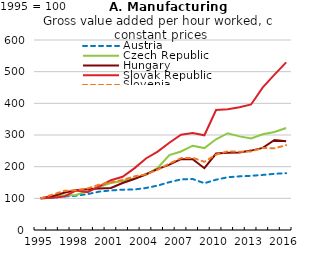
| Category | Austria | Czech Republic | Hungary | Slovak Republic | Slovenia |
|---|---|---|---|---|---|
| 1995.0 | 100 | 100 | 100 | 100 | 100 |
| 1996.0 | 102 | 106.161 | 106.652 | 101.455 | 111.687 |
| 1997.0 | 105.864 | 108.725 | 117.854 | 105.685 | 123.592 |
| 1998.0 | 108.261 | 110.869 | 125.454 | 124.488 | 125.761 |
| 1999.0 | 113.343 | 122.65 | 128.776 | 119.588 | 131.157 |
| 2000.0 | 121.093 | 136.641 | 131.42 | 137.933 | 143.254 |
| 2001.0 | 124.96 | 148.258 | 132.763 | 157.103 | 150.732 |
| 2002.0 | 127.346 | 154.896 | 148.233 | 168.209 | 157.935 |
| 2003.0 | 127.815 | 163.405 | 160.887 | 194.619 | 169.361 |
| 2004.0 | 132.717 | 174.194 | 176.01 | 225.844 | 175.677 |
| 2005.0 | 140.292 | 195.969 | 192.028 | 247.73 | 190.426 |
| 2006.0 | 151.05 | 236.837 | 206.205 | 275.635 | 209.572 |
| 2007.0 | 159.695 | 248.034 | 223.723 | 300.673 | 226.943 |
| 2008.0 | 160.939 | 266.218 | 223.309 | 305.999 | 227.861 |
| 2009.0 | 147.749 | 258.703 | 195.059 | 299.089 | 215.283 |
| 2010.0 | 158.856 | 286.389 | 241.427 | 378.902 | 238.136 |
| 2011.0 | 166.523 | 305.567 | 244.044 | 381.146 | 248.54 |
| 2012.0 | 169.413 | 295.682 | 244.839 | 387.456 | 247.106 |
| 2013.0 | 171.106 | 289.155 | 250.719 | 396.364 | 248.266 |
| 2014.0 | 174.022 | 302.359 | 259.14 | 450.17 | 258.91 |
| 2015.0 | 177.39 | 309.433 | 284.09 | 490.477 | 258.137 |
| 2016.0 | 179.499 | 322.292 | 280.321 | 529.268 | 267.979 |